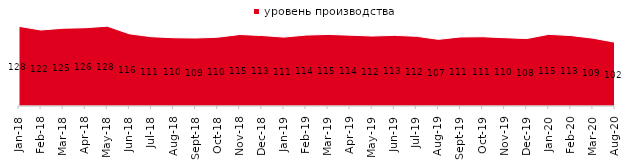
| Category | уровень производства |
|---|---|
| 2018-01-01 | 127.8 |
| 2018-02-01 | 121.95 |
| 2018-03-01 | 124.8 |
| 2018-04-01 | 125.6 |
| 2018-05-01 | 128.1 |
| 2018-06-01 | 115.8 |
| 2018-07-01 | 111.15 |
| 2018-08-01 | 109.55 |
| 2018-09-01 | 109.1 |
| 2018-10-01 | 110.35 |
| 2018-11-01 | 114.721 |
| 2018-12-01 | 113.1 |
| 2019-01-01 | 110.55 |
| 2019-02-01 | 113.8 |
| 2019-03-01 | 114.868 |
| 2019-04-01 | 113.663 |
| 2019-05-01 | 112.283 |
| 2019-06-01 | 113.367 |
| 2019-07-01 | 111.881 |
| 2019-08-01 | 106.943 |
| 2019-09-01 | 110.792 |
| 2019-10-01 | 111.139 |
| 2019-11-01 | 109.604 |
| 2019-12-01 | 108.218 |
| 2020-01-01 | 115 |
| 2020-02-01 | 113.069 |
| 2020-03-01 | 108.825 |
| 2020-08-01 | 102.284 |